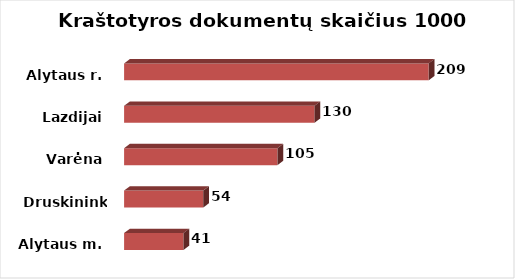
| Category | Series 0 |
|---|---|
| Alytaus m. | 40.673 |
| Druskininkai | 54.178 |
| Varėna | 104.981 |
| Lazdijai | 130.399 |
| Alytaus r. | 208.545 |